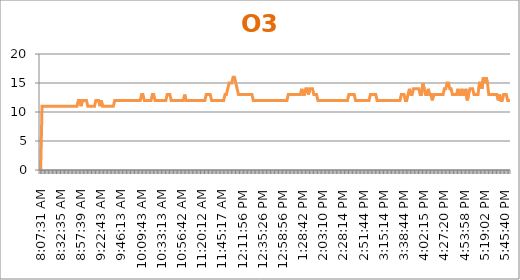
| Category | O3 (ppb) |
|---|---|
| 0.3385532407407407 | 0 |
| 0.3396412037037037 | 11 |
| 0.3407291666666667 | 11 |
| 0.3418171296296297 | 11 |
| 0.34290509259259255 | 11 |
| 0.34399305555555554 | 11 |
| 0.3450810185185185 | 11 |
| 0.34616898148148145 | 11 |
| 0.34725694444444444 | 11 |
| 0.34943287037037035 | 11 |
| 0.35052083333333334 | 11 |
| 0.3516087962962963 | 11 |
| 0.3526967592592593 | 11 |
| 0.3537847222222222 | 11 |
| 0.35487268518518517 | 11 |
| 0.35596064814814815 | 11 |
| 0.3570486111111111 | 11 |
| 0.35813657407407407 | 11 |
| 0.35922453703703705 | 11 |
| 0.36031250000000004 | 11 |
| 0.36140046296296297 | 11 |
| 0.36248842592592595 | 11 |
| 0.3646643518518518 | 11 |
| 0.3657523148148148 | 11 |
| 0.3668402777777778 | 11 |
| 0.3679282407407407 | 11 |
| 0.3690162037037037 | 11 |
| 0.3701041666666667 | 11 |
| 0.37119212962962966 | 12 |
| 0.3722800925925926 | 12 |
| 0.3733680555555556 | 11 |
| 0.37445601851851856 | 12 |
| 0.37554398148148144 | 12 |
| 0.3766319444444444 | 12 |
| 0.3777199074074074 | 12 |
| 0.37880787037037034 | 11 |
| 0.3798958333333333 | 11 |
| 0.3809837962962963 | 11 |
| 0.3820717592592593 | 11 |
| 0.3831597222222222 | 11 |
| 0.3842476851851852 | 11 |
| 0.3853356481481482 | 12 |
| 0.38642361111111106 | 12 |
| 0.38751157407407405 | 12 |
| 0.38968749999999996 | 11 |
| 0.39077546296296295 | 12 |
| 0.39186342592592593 | 11 |
| 0.3929513888888889 | 11 |
| 0.39403935185185185 | 11 |
| 0.39512731481481483 | 11 |
| 0.3962152777777778 | 11 |
| 0.3973032407407407 | 11 |
| 0.3983912037037037 | 11 |
| 0.39947916666666666 | 11 |
| 0.40056712962962965 | 11 |
| 0.4016550925925926 | 12 |
| 0.40274305555555556 | 12 |
| 0.40383101851851855 | 12 |
| 0.4049189814814815 | 12 |
| 0.40600694444444446 | 12 |
| 0.40709490740740745 | 12 |
| 0.4081828703703703 | 12 |
| 0.4092708333333333 | 12 |
| 0.4103587962962963 | 12 |
| 0.4114467592592593 | 12 |
| 0.4125347222222222 | 12 |
| 0.4136226851851852 | 12 |
| 0.4147106481481482 | 12 |
| 0.4157986111111111 | 12 |
| 0.4168865740740741 | 12 |
| 0.4179745370370371 | 12 |
| 0.41906249999999995 | 12 |
| 0.42015046296296293 | 12 |
| 0.4212384259259259 | 12 |
| 0.4223263888888889 | 12 |
| 0.42341435185185183 | 13 |
| 0.4245023148148148 | 13 |
| 0.4255902777777778 | 12 |
| 0.42667824074074073 | 12 |
| 0.4277662037037037 | 12 |
| 0.4288541666666667 | 12 |
| 0.4299421296296296 | 12 |
| 0.43103009259259256 | 12 |
| 0.43211805555555555 | 13 |
| 0.43320601851851853 | 13 |
| 0.43429398148148146 | 12 |
| 0.43538194444444445 | 12 |
| 0.43646990740740743 | 12 |
| 0.43755787037037036 | 12 |
| 0.43864583333333335 | 12 |
| 0.43973379629629633 | 12 |
| 0.4408217592592592 | 12 |
| 0.4419097222222222 | 12 |
| 0.4429976851851852 | 12 |
| 0.44408564814814816 | 13 |
| 0.4451736111111111 | 13 |
| 0.4462615740740741 | 13 |
| 0.44734953703703706 | 12 |
| 0.4484375 | 12 |
| 0.449525462962963 | 12 |
| 0.4506018518518518 | 12 |
| 0.4516898148148148 | 12 |
| 0.4527777777777778 | 12 |
| 0.4538657407407407 | 12 |
| 0.4549537037037037 | 12 |
| 0.4560416666666667 | 12 |
| 0.45712962962962966 | 12 |
| 0.4582175925925926 | 13 |
| 0.4593055555555556 | 12 |
| 0.46039351851851856 | 12 |
| 0.46148148148148144 | 12 |
| 0.4625694444444444 | 12 |
| 0.4636574074074074 | 12 |
| 0.46474537037037034 | 12 |
| 0.4658333333333333 | 12 |
| 0.4669212962962963 | 12 |
| 0.4680092592592593 | 12 |
| 0.4690972222222222 | 12 |
| 0.4701851851851852 | 12 |
| 0.4712731481481482 | 12 |
| 0.47236111111111106 | 12 |
| 0.47344907407407405 | 12 |
| 0.47453703703703703 | 12 |
| 0.47562499999999996 | 13 |
| 0.47671296296296295 | 13 |
| 0.47780092592592593 | 13 |
| 0.4788888888888889 | 13 |
| 0.47997685185185185 | 12 |
| 0.4821527777777778 | 12 |
| 0.4832407407407407 | 12 |
| 0.4843287037037037 | 12 |
| 0.48541666666666666 | 12 |
| 0.4865162037037037 | 12 |
| 0.48760416666666667 | 12 |
| 0.4886921296296296 | 12 |
| 0.4897800925925926 | 12 |
| 0.49086805555555557 | 12 |
| 0.4919560185185185 | 13 |
| 0.4930439814814815 | 13 |
| 0.49413194444444447 | 14 |
| 0.4952314814814815 | 15 |
| 0.4963194444444445 | 15 |
| 0.49740740740740735 | 15 |
| 0.49849537037037034 | 16 |
| 0.4995833333333333 | 16 |
| 0.5006712962962964 | 15 |
| 0.5039351851851852 | 14 |
| 0.5050231481481481 | 13 |
| 0.5061111111111111 | 13 |
| 0.507199074074074 | 13 |
| 0.508287037037037 | 13 |
| 0.509375 | 13 |
| 0.510462962962963 | 13 |
| 0.511550925925926 | 13 |
| 0.5126388888888889 | 13 |
| 0.5137268518518519 | 13 |
| 0.5148148148148148 | 13 |
| 0.5159027777777777 | 13 |
| 0.5169907407407407 | 12 |
| 0.5180787037037037 | 12 |
| 0.5191666666666667 | 12 |
| 0.5202546296296297 | 12 |
| 0.5213425925925926 | 12 |
| 0.5224305555555556 | 12 |
| 0.5235185185185185 | 12 |
| 0.5246064814814815 | 12 |
| 0.5256944444444445 | 12 |
| 0.5267824074074073 | 12 |
| 0.5278703703703703 | 12 |
| 0.5289583333333333 | 12 |
| 0.5300462962962963 | 12 |
| 0.5311342592592593 | 12 |
| 0.5322222222222223 | 12 |
| 0.5333101851851852 | 12 |
| 0.5343981481481481 | 12 |
| 0.5354861111111111 | 12 |
| 0.5365740740740741 | 12 |
| 0.537662037037037 | 12 |
| 0.53875 | 12 |
| 0.5398379629629629 | 12 |
| 0.5409259259259259 | 12 |
| 0.5420138888888889 | 12 |
| 0.5431018518518519 | 12 |
| 0.5441898148148149 | 12 |
| 0.5452777777777778 | 13 |
| 0.5463657407407407 | 13 |
| 0.5474537037037037 | 13 |
| 0.5485416666666666 | 13 |
| 0.5496296296296296 | 13 |
| 0.5507175925925926 | 13 |
| 0.5518055555555555 | 13 |
| 0.5528935185185185 | 13 |
| 0.5539814814814815 | 13 |
| 0.5572453703703704 | 13 |
| 0.5605092592592592 | 14 |
| 0.5615972222222222 | 13 |
| 0.5626851851851852 | 13 |
| 0.5659490740740741 | 14 |
| 0.567037037037037 | 14 |
| 0.568125 | 13 |
| 0.569212962962963 | 14 |
| 0.570300925925926 | 14 |
| 0.5724768518518518 | 14 |
| 0.5735648148148148 | 13 |
| 0.5790046296296296 | 13 |
| 0.5800925925925926 | 13 |
| 0.5811805555555556 | 12 |
| 0.5822685185185185 | 12 |
| 0.5833564814814814 | 12 |
| 0.5844444444444444 | 12 |
| 0.5855324074074074 | 12 |
| 0.5866203703703704 | 12 |
| 0.5877083333333334 | 12 |
| 0.5887962962962963 | 12 |
| 0.5898842592592592 | 12 |
| 0.5909722222222222 | 12 |
| 0.5931481481481481 | 12 |
| 0.5942361111111111 | 12 |
| 0.5953240740740741 | 12 |
| 0.596412037037037 | 12 |
| 0.5975 | 12 |
| 0.598587962962963 | 12 |
| 0.599675925925926 | 12 |
| 0.6007638888888889 | 12 |
| 0.6018518518518519 | 12 |
| 0.6029398148148148 | 12 |
| 0.6040277777777777 | 12 |
| 0.6051157407407407 | 12 |
| 0.6062037037037037 | 12 |
| 0.6072916666666667 | 13 |
| 0.6083796296296297 | 13 |
| 0.6094675925925926 | 13 |
| 0.6105555555555556 | 13 |
| 0.6116435185185185 | 13 |
| 0.6127314814814815 | 12 |
| 0.6138194444444445 | 12 |
| 0.6149074074074073 | 12 |
| 0.6159953703703703 | 12 |
| 0.6170833333333333 | 12 |
| 0.6181712962962963 | 12 |
| 0.6192592592592593 | 12 |
| 0.6203472222222223 | 12 |
| 0.6214351851851853 | 12 |
| 0.6225231481481481 | 12 |
| 0.6236111111111111 | 12 |
| 0.6246990740740741 | 13 |
| 0.625787037037037 | 13 |
| 0.626875 | 13 |
| 0.627962962962963 | 13 |
| 0.6290509259259259 | 13 |
| 0.6301388888888889 | 12 |
| 0.6312268518518519 | 12 |
| 0.6323148148148149 | 12 |
| 0.6334027777777778 | 12 |
| 0.6344907407407407 | 12 |
| 0.6355787037037037 | 12 |
| 0.6366666666666666 | 12 |
| 0.6377546296296296 | 12 |
| 0.6388425925925926 | 12 |
| 0.6399305555555556 | 12 |
| 0.6410185185185185 | 12 |
| 0.6421064814814815 | 12 |
| 0.6431944444444445 | 12 |
| 0.6442824074074074 | 12 |
| 0.6453703703703704 | 12 |
| 0.6464583333333334 | 12 |
| 0.6475462962962962 | 12 |
| 0.6486342592592592 | 12 |
| 0.6497222222222222 | 13 |
| 0.6508101851851852 | 13 |
| 0.6518981481481482 | 13 |
| 0.6529861111111112 | 12 |
| 0.6540740740740741 | 12 |
| 0.655162037037037 | 13 |
| 0.65625 | 14 |
| 0.657337962962963 | 13 |
| 0.6584259259259259 | 13 |
| 0.6595138888888888 | 14 |
| 0.6606018518518518 | 14 |
| 0.6616898148148148 | 14 |
| 0.6627777777777778 | 14 |
| 0.6638657407407408 | 14 |
| 0.6649537037037038 | 13 |
| 0.6660416666666666 | 13 |
| 0.6671296296296297 | 15 |
| 0.6682291666666668 | 14 |
| 0.6693171296296296 | 13 |
| 0.6704050925925925 | 13 |
| 0.6714930555555556 | 14 |
| 0.6725810185185185 | 13 |
| 0.6736805555555555 | 13 |
| 0.6747685185185185 | 12 |
| 0.6769444444444445 | 13 |
| 0.6780324074074073 | 13 |
| 0.6791203703703704 | 13 |
| 0.6802083333333333 | 13 |
| 0.6812962962962964 | 13 |
| 0.6823842592592593 | 13 |
| 0.6834722222222221 | 13 |
| 0.6845601851851852 | 13 |
| 0.6856481481481481 | 14 |
| 0.6878240740740741 | 14 |
| 0.6889120370370371 | 15 |
| 0.69 | 15 |
| 0.691087962962963 | 14 |
| 0.6921759259259259 | 14 |
| 0.6943518518518519 | 13 |
| 0.6954398148148148 | 13 |
| 0.6965277777777777 | 13 |
| 0.6976157407407407 | 13 |
| 0.6987037037037037 | 14 |
| 0.6997916666666667 | 13 |
| 0.7008796296296297 | 13 |
| 0.7019675925925926 | 14 |
| 0.7030555555555557 | 13 |
| 0.7041435185185185 | 13 |
| 0.7052314814814814 | 14 |
| 0.7074074074074074 | 12 |
| 0.7084953703703704 | 13 |
| 0.7095833333333333 | 14 |
| 0.7106712962962963 | 14 |
| 0.7117592592592592 | 14 |
| 0.7128472222222223 | 13 |
| 0.7139351851851852 | 13 |
| 0.715023148148148 | 13 |
| 0.7161111111111111 | 13 |
| 0.717199074074074 | 15 |
| 0.718287037037037 | 15 |
| 0.719375 | 14 |
| 0.720462962962963 | 16 |
| 0.721550925925926 | 15 |
| 0.7226388888888889 | 16 |
| 0.7237268518518518 | 15 |
| 0.7269907407407407 | 13 |
| 0.7280787037037038 | 13 |
| 0.7291666666666666 | 13 |
| 0.7302546296296296 | 13 |
| 0.7313425925925926 | 13 |
| 0.7324305555555556 | 13 |
| 0.7335185185185185 | 13 |
| 0.7346064814814816 | 12 |
| 0.7356944444444444 | 13 |
| 0.7367824074074073 | 12 |
| 0.7378703703703704 | 12 |
| 0.7389583333333333 | 13 |
| 0.7400462962962964 | 13 |
| 0.7411342592592592 | 13 |
| 0.7422222222222222 | 12 |
| 0.7433101851851852 | 12 |
| 0.7443981481481482 | 12 |